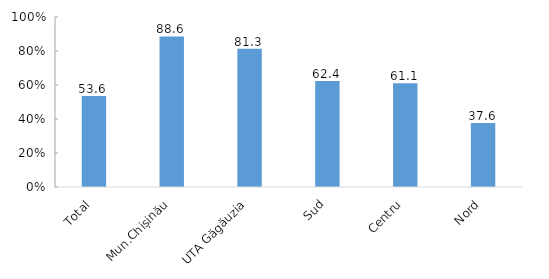
| Category | Series 0 |
|---|---|
| Total | 53.6 |
| Mun.Chișinău | 88.6 |
| UTA Găgăuzia | 81.3 |
| Sud | 62.4 |
| Centru | 61.1 |
| Nord | 37.6 |